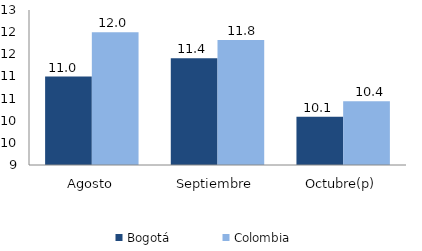
| Category | Bogotá | Colombia |
|---|---|---|
| Agosto | 10.998 | 11.997 |
| Septiembre | 11.413 | 11.82 |
| Octubre(p) | 10.088 | 10.438 |